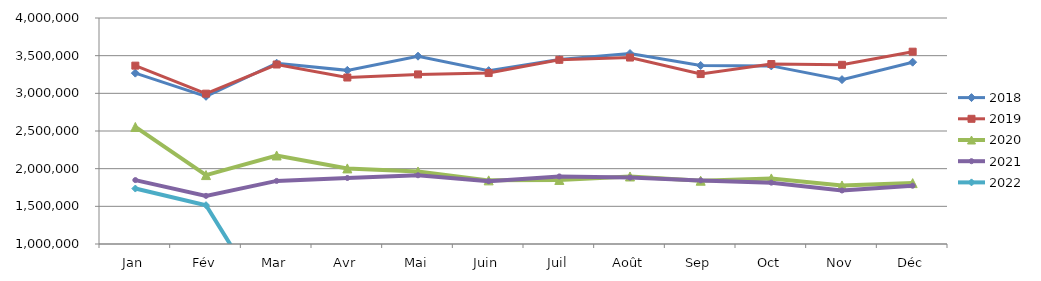
| Category | 2018 | 2019 | 2020 | 2021 | 2022 |
|---|---|---|---|---|---|
| Jan | 3268127.156 | 3367510.542 | 2553542.465 | 1848435.265 | 1735995.843 |
| Fév | 2960518.709 | 2995707.194 | 1914783.421 | 1639009.953 | 1515103.941 |
| Mar | 3399788.443 | 3382590.899 | 2175089.683 | 1837369.769 | 0 |
| Avr | 3304906.324 | 3209954.832 | 2003293.895 | 1876404.979 | 0 |
| Mai | 3492911.082 | 3251146.092 | 1962510.702 | 1912345.285 | 0 |
| Juin | 3300924.802 | 3269085.474 | 1844603.728 | 1833702.622 | 0 |
| Juil | 3448603.566 | 3445052.713 | 1850370.172 | 1896825.197 | 0 |
| Août | 3528173.012 | 3474993.525 | 1896365.756 | 1881267.945 | 0 |
| Sep | 3369626.193 | 3255644.054 | 1840205.182 | 1844525.749 | 0 |
| Oct | 3364260.879 | 3388972.2 | 1870450.237 | 1814485.706 | 0 |
| Nov | 3181888.576 | 3378477.919 | 1777011.858 | 1710700.553 | 0 |
| Déc | 3413454.996 | 3552894.26 | 1808480.012 | 1774263.924 | 0 |